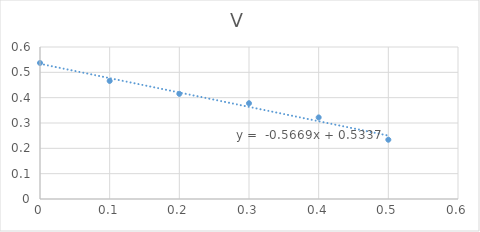
| Category | V |
|---|---|
| 0.5 | 0.234 |
| 0.4 | 0.322 |
| 0.3 | 0.378 |
| 0.2 | 0.415 |
| 0.1 | 0.466 |
| 0.0 | 0.537 |